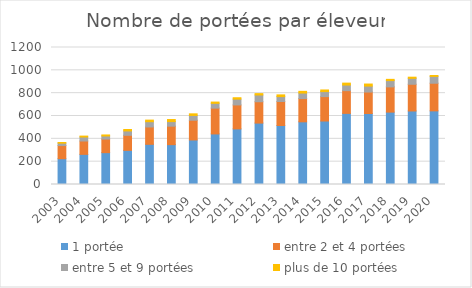
| Category | 1 portée | entre 2 et 4 portées | entre 5 et 9 portées | plus de 10 portées |
|---|---|---|---|---|
| 2003.0 | 226 | 115 | 21 | 6 |
| 2004.0 | 264 | 117 | 35 | 8 |
| 2005.0 | 279 | 119 | 27 | 9 |
| 2006.0 | 299 | 132 | 38 | 13 |
| 2007.0 | 352 | 152 | 46 | 14 |
| 2008.0 | 349 | 162 | 40 | 18 |
| 2009.0 | 390 | 173 | 42 | 14 |
| 2010.0 | 443 | 226 | 42 | 11 |
| 2011.0 | 487 | 210 | 51 | 12 |
| 2012.0 | 538 | 187 | 59 | 12 |
| 2013.0 | 517 | 210 | 43 | 15 |
| 2014.0 | 549 | 204 | 48 | 15 |
| 2015.0 | 556 | 214 | 44 | 14 |
| 2016.0 | 623 | 199 | 49 | 17 |
| 2017.0 | 622 | 188 | 52 | 18 |
| 2018.0 | 634 | 221 | 55 | 11 |
| 2019.0 | 644 | 234 | 52 | 10 |
| 2020.0 | 645 | 242 | 60 | 8 |